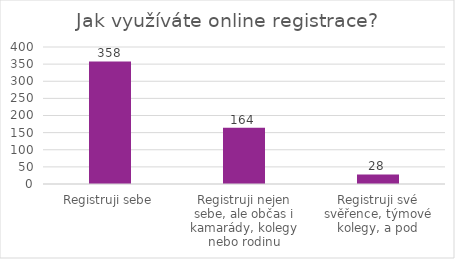
| Category | Series 0 |
|---|---|
| Registruji sebe | 358 |
| Registruji nejen sebe, ale občas i kamarády, kolegy nebo rodinu | 164 |
| Registruji své svěřence, týmové kolegy, a pod | 28 |